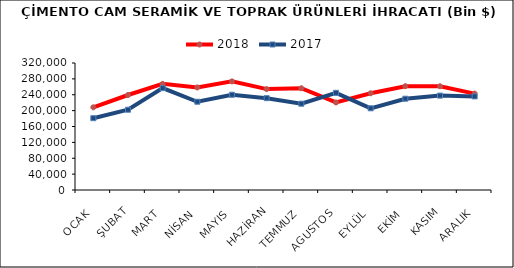
| Category | 2018 | 2017 |
|---|---|---|
| OCAK | 208341.553 | 180942.399 |
| ŞUBAT | 239377.085 | 202271.864 |
| MART | 267416.547 | 256830.351 |
| NİSAN | 258397.529 | 222371.256 |
| MAYIS | 273635.411 | 239963.529 |
| HAZİRAN | 254255.871 | 231400.932 |
| TEMMUZ | 256374.183 | 217437.46 |
| AGUSTOS | 220595.306 | 244812.486 |
| EYLÜL | 243695.431 | 205829.614 |
| EKİM | 261530.043 | 230035.07 |
| KASIM | 261337.681 | 237808.232 |
| ARALIK | 242942.166 | 235846.61 |